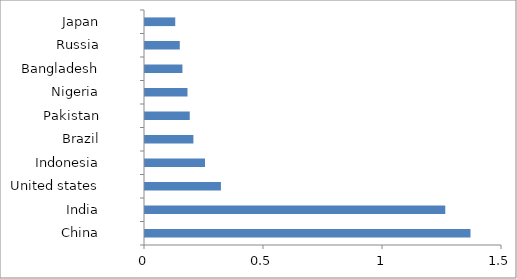
| Category | Population (billion) |
|---|---|
| China | 1.368 |
| India | 1.262 |
| United states | 0.319 |
| Indonesia | 0.252 |
| Brazil | 0.203 |
| Pakistan | 0.188 |
| Nigeria | 0.179 |
| Bangladesh | 0.157 |
| Russia | 0.146 |
| Japan | 0.127 |